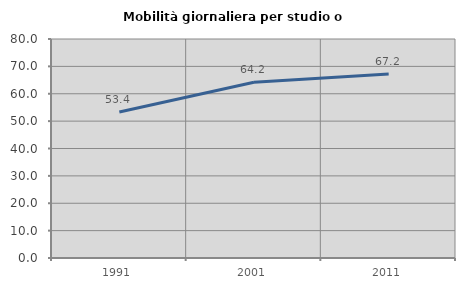
| Category | Mobilità giornaliera per studio o lavoro |
|---|---|
| 1991.0 | 53.363 |
| 2001.0 | 64.216 |
| 2011.0 | 67.22 |